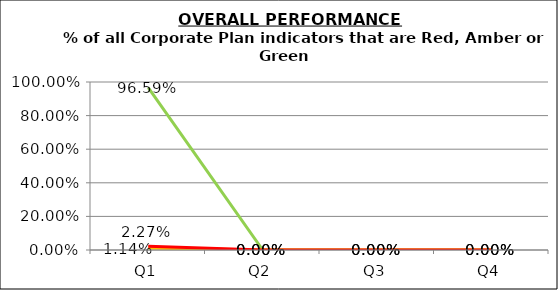
| Category | Green | Amber | Red |
|---|---|---|---|
| Q1 | 0.966 | 0.011 | 0.023 |
| Q2 | 0 | 0 | 0 |
| Q3 | 0 | 0 | 0 |
| Q4 | 0 | 0 | 0 |